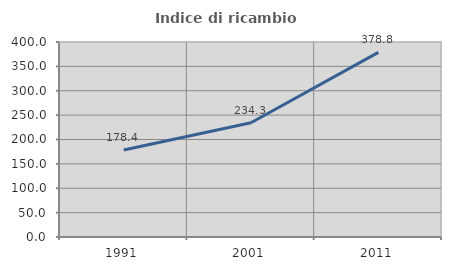
| Category | Indice di ricambio occupazionale  |
|---|---|
| 1991.0 | 178.431 |
| 2001.0 | 234.328 |
| 2011.0 | 378.761 |